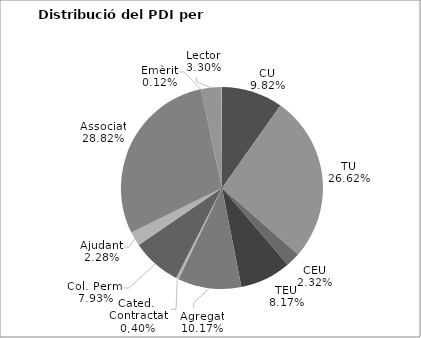
| Category | Series 0 |
|---|---|
| CU | 250 |
| TU | 678 |
| CEU | 59 |
| TEU | 208 |
| Agregat | 259 |
| Cated. Contractat | 11 |
| Col. Perm. | 202 |
| Ajudant | 58 |
| Associat | 734 |
| Emèrit | 3 |
| Lector | 84 |
| Altres | 1 |